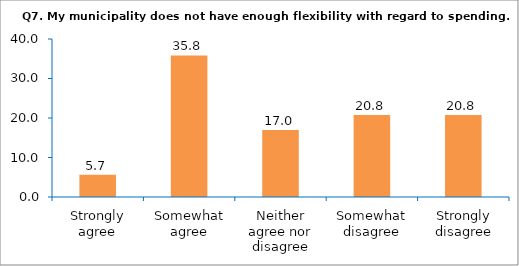
| Category | Series 0 |
|---|---|
| Strongly agree | 5.66 |
| Somewhat agree | 35.849 |
| Neither agree nor disagree | 16.981 |
| Somewhat disagree | 20.755 |
| Strongly disagree | 20.755 |